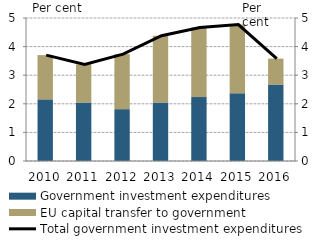
| Category | Government investment expenditures | EU capital transfer to government |
|---|---|---|
| 2010.0 | 2.156 | 1.547 |
| 2011.0 | 2.049 | 1.329 |
| 2012.0 | 1.812 | 1.924 |
| 2013.0 | 2.047 | 2.335 |
| 2014.0 | 2.237 | 2.429 |
| 2015.0 | 2.372 | 2.397 |
| 2016.0 | 2.674 | 0.906 |